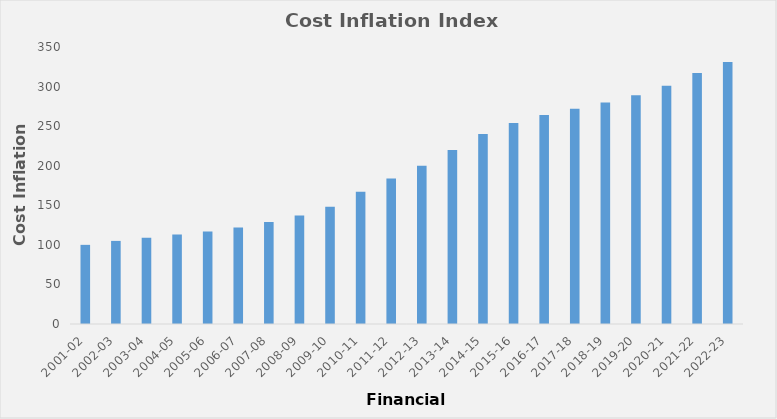
| Category | Series 0 |
|---|---|
| 2001-02 | 100 |
| 2002-03 | 105 |
| 2003-04 | 109 |
| 2004-05 | 113 |
| 2005-06 | 117 |
| 2006-07 | 122 |
| 2007-08 | 129 |
| 2008-09 | 137 |
| 2009-10 | 148 |
| 2010-11 | 167 |
| 2011-12 | 184 |
| 2012-13 | 200 |
| 2013-14 | 220 |
| 2014-15 | 240 |
| 2015-16 | 254 |
| 2016-17 | 264 |
| 2017-18 | 272 |
| 2018-19 | 280 |
| 2019-20 | 289 |
| 2020-21 | 301 |
| 2021-22 | 317 |
| 2022-23 | 331 |